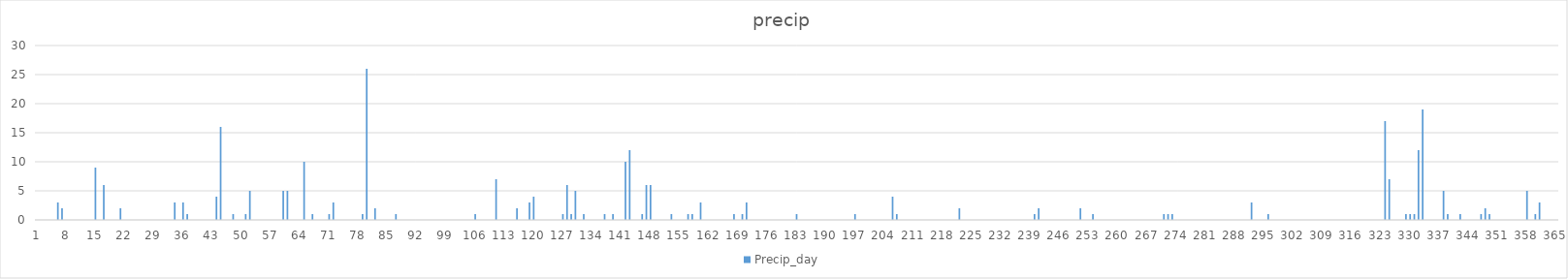
| Category | Precip_day |
|---|---|
| 0 | 0 |
| 1 | 0 |
| 2 | 0 |
| 3 | 0 |
| 4 | 0 |
| 5 | 3 |
| 6 | 2 |
| 7 | 0 |
| 8 | 0 |
| 9 | 0 |
| 10 | 0 |
| 11 | 0 |
| 12 | 0 |
| 13 | 0 |
| 14 | 9 |
| 15 | 0 |
| 16 | 6 |
| 17 | 0 |
| 18 | 0 |
| 19 | 0 |
| 20 | 2 |
| 21 | 0 |
| 22 | 0 |
| 23 | 0 |
| 24 | 0 |
| 25 | 0 |
| 26 | 0 |
| 27 | 0 |
| 28 | 0 |
| 29 | 0 |
| 30 | 0 |
| 31 | 0 |
| 32 | 0 |
| 33 | 3 |
| 34 | 0 |
| 35 | 3 |
| 36 | 1 |
| 37 | 0 |
| 38 | 0 |
| 39 | 0 |
| 40 | 0 |
| 41 | 0 |
| 42 | 0 |
| 43 | 4 |
| 44 | 16 |
| 45 | 0 |
| 46 | 0 |
| 47 | 1 |
| 48 | 0 |
| 49 | 0 |
| 50 | 1 |
| 51 | 5 |
| 52 | 0 |
| 53 | 0 |
| 54 | 0 |
| 55 | 0 |
| 56 | 0 |
| 57 | 0 |
| 58 | 0 |
| 59 | 5 |
| 60 | 5 |
| 61 | 0 |
| 62 | 0 |
| 63 | 0 |
| 64 | 10 |
| 65 | 0 |
| 66 | 1 |
| 67 | 0 |
| 68 | 0 |
| 69 | 0 |
| 70 | 1 |
| 71 | 3 |
| 72 | 0 |
| 73 | 0 |
| 74 | 0 |
| 75 | 0 |
| 76 | 0 |
| 77 | 0 |
| 78 | 1 |
| 79 | 26 |
| 80 | 0 |
| 81 | 2 |
| 82 | 0 |
| 83 | 0 |
| 84 | 0 |
| 85 | 0 |
| 86 | 1 |
| 87 | 0 |
| 88 | 0 |
| 89 | 0 |
| 90 | 0 |
| 91 | 0 |
| 92 | 0 |
| 93 | 0 |
| 94 | 0 |
| 95 | 0 |
| 96 | 0 |
| 97 | 0 |
| 98 | 0 |
| 99 | 0 |
| 100 | 0 |
| 101 | 0 |
| 102 | 0 |
| 103 | 0 |
| 104 | 0 |
| 105 | 1 |
| 106 | 0 |
| 107 | 0 |
| 108 | 0 |
| 109 | 0 |
| 110 | 7 |
| 111 | 0 |
| 112 | 0 |
| 113 | 0 |
| 114 | 0 |
| 115 | 2 |
| 116 | 0 |
| 117 | 0 |
| 118 | 3 |
| 119 | 4 |
| 120 | 0 |
| 121 | 0 |
| 122 | 0 |
| 123 | 0 |
| 124 | 0 |
| 125 | 0 |
| 126 | 1 |
| 127 | 6 |
| 128 | 1 |
| 129 | 5 |
| 130 | 0 |
| 131 | 1 |
| 132 | 0 |
| 133 | 0 |
| 134 | 0 |
| 135 | 0 |
| 136 | 1 |
| 137 | 0 |
| 138 | 1 |
| 139 | 0 |
| 140 | 0 |
| 141 | 10 |
| 142 | 12 |
| 143 | 0 |
| 144 | 0 |
| 145 | 1 |
| 146 | 6 |
| 147 | 6 |
| 148 | 0 |
| 149 | 0 |
| 150 | 0 |
| 151 | 0 |
| 152 | 1 |
| 153 | 0 |
| 154 | 0 |
| 155 | 0 |
| 156 | 1 |
| 157 | 1 |
| 158 | 0 |
| 159 | 3 |
| 160 | 0 |
| 161 | 0 |
| 162 | 0 |
| 163 | 0 |
| 164 | 0 |
| 165 | 0 |
| 166 | 0 |
| 167 | 1 |
| 168 | 0 |
| 169 | 1 |
| 170 | 3 |
| 171 | 0 |
| 172 | 0 |
| 173 | 0 |
| 174 | 0 |
| 175 | 0 |
| 176 | 0 |
| 177 | 0 |
| 178 | 0 |
| 179 | 0 |
| 180 | 0 |
| 181 | 0 |
| 182 | 1 |
| 183 | 0 |
| 184 | 0 |
| 185 | 0 |
| 186 | 0 |
| 187 | 0 |
| 188 | 0 |
| 189 | 0 |
| 190 | 0 |
| 191 | 0 |
| 192 | 0 |
| 193 | 0 |
| 194 | 0 |
| 195 | 0 |
| 196 | 1 |
| 197 | 0 |
| 198 | 0 |
| 199 | 0 |
| 200 | 0 |
| 201 | 0 |
| 202 | 0 |
| 203 | 0 |
| 204 | 0 |
| 205 | 4 |
| 206 | 1 |
| 207 | 0 |
| 208 | 0 |
| 209 | 0 |
| 210 | 0 |
| 211 | 0 |
| 212 | 0 |
| 213 | 0 |
| 214 | 0 |
| 215 | 0 |
| 216 | 0 |
| 217 | 0 |
| 218 | 0 |
| 219 | 0 |
| 220 | 0 |
| 221 | 2 |
| 222 | 0 |
| 223 | 0 |
| 224 | 0 |
| 225 | 0 |
| 226 | 0 |
| 227 | 0 |
| 228 | 0 |
| 229 | 0 |
| 230 | 0 |
| 231 | 0 |
| 232 | 0 |
| 233 | 0 |
| 234 | 0 |
| 235 | 0 |
| 236 | 0 |
| 237 | 0 |
| 238 | 0 |
| 239 | 1 |
| 240 | 2 |
| 241 | 0 |
| 242 | 0 |
| 243 | 0 |
| 244 | 0 |
| 245 | 0 |
| 246 | 0 |
| 247 | 0 |
| 248 | 0 |
| 249 | 0 |
| 250 | 2 |
| 251 | 0 |
| 252 | 0 |
| 253 | 1 |
| 254 | 0 |
| 255 | 0 |
| 256 | 0 |
| 257 | 0 |
| 258 | 0 |
| 259 | 0 |
| 260 | 0 |
| 261 | 0 |
| 262 | 0 |
| 263 | 0 |
| 264 | 0 |
| 265 | 0 |
| 266 | 0 |
| 267 | 0 |
| 268 | 0 |
| 269 | 0 |
| 270 | 1 |
| 271 | 1 |
| 272 | 1 |
| 273 | 0 |
| 274 | 0 |
| 275 | 0 |
| 276 | 0 |
| 277 | 0 |
| 278 | 0 |
| 279 | 0 |
| 280 | 0 |
| 281 | 0 |
| 282 | 0 |
| 283 | 0 |
| 284 | 0 |
| 285 | 0 |
| 286 | 0 |
| 287 | 0 |
| 288 | 0 |
| 289 | 0 |
| 290 | 0 |
| 291 | 3 |
| 292 | 0 |
| 293 | 0 |
| 294 | 0 |
| 295 | 1 |
| 296 | 0 |
| 297 | 0 |
| 298 | 0 |
| 299 | 0 |
| 300 | 0 |
| 301 | 0 |
| 302 | 0 |
| 303 | 0 |
| 304 | 0 |
| 305 | 0 |
| 306 | 0 |
| 307 | 0 |
| 308 | 0 |
| 309 | 0 |
| 310 | 0 |
| 311 | 0 |
| 312 | 0 |
| 313 | 0 |
| 314 | 0 |
| 315 | 0 |
| 316 | 0 |
| 317 | 0 |
| 318 | 0 |
| 319 | 0 |
| 320 | 0 |
| 321 | 0 |
| 322 | 0 |
| 323 | 17 |
| 324 | 7 |
| 325 | 0 |
| 326 | 0 |
| 327 | 0 |
| 328 | 1 |
| 329 | 1 |
| 330 | 1 |
| 331 | 12 |
| 332 | 19 |
| 333 | 0 |
| 334 | 0 |
| 335 | 0 |
| 336 | 0 |
| 337 | 5 |
| 338 | 1 |
| 339 | 0 |
| 340 | 0 |
| 341 | 1 |
| 342 | 0 |
| 343 | 0 |
| 344 | 0 |
| 345 | 0 |
| 346 | 1 |
| 347 | 2 |
| 348 | 1 |
| 349 | 0 |
| 350 | 0 |
| 351 | 0 |
| 352 | 0 |
| 353 | 0 |
| 354 | 0 |
| 355 | 0 |
| 356 | 0 |
| 357 | 5 |
| 358 | 0 |
| 359 | 1 |
| 360 | 3 |
| 361 | 0 |
| 362 | 0 |
| 363 | 0 |
| 364 | 0 |